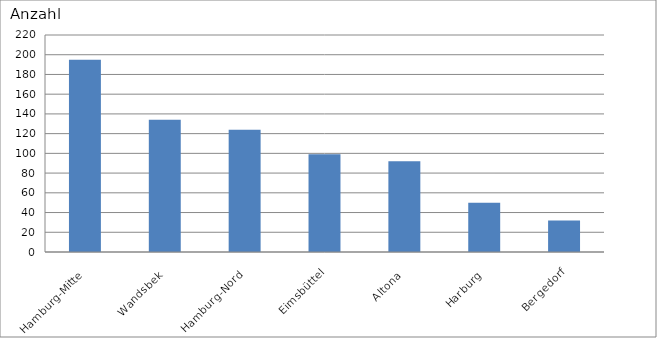
| Category | Hamburg-Mitte Wandsbek Hamburg-Nord Eimsbüttel Altona Harburg Bergedorf |
|---|---|
| Hamburg-Mitte | 195 |
| Wandsbek | 134 |
| Hamburg-Nord | 124 |
| Eimsbüttel | 99 |
| Altona | 92 |
| Harburg | 50 |
| Bergedorf | 32 |